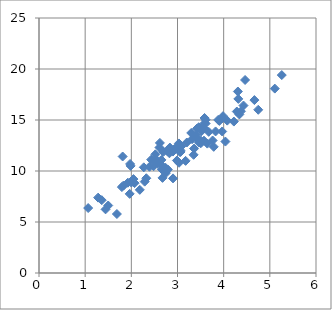
| Category | Series 0 |
|---|---|
| 2.776635329112736 | 11.978 |
| 3.0627706059416373 | 12.02 |
| 3.573220837859455 | 12.973 |
| 2.5729919688299416 | 10.743 |
| 3.9701212152127345 | 15.173 |
| 2.528039879391941 | 11.17 |
| 2.392834814192498 | 10.415 |
| 4.339641156514291 | 15.544 |
| 3.0330298010017316 | 10.809 |
| 2.675731558317578 | 9.325 |
| 3.4202894583534738 | 14.156 |
| 1.9642335198431629 | 7.758 |
| 3.6096875936638693 | 15.028 |
| 2.8251744137852013 | 11.736 |
| 2.324008158845178 | 9.288 |
| 3.3953996699934454 | 13.502 |
| 1.9732571464009183 | 10.69 |
| 1.830726085806746 | 8.575 |
| 3.406402156362916 | 13.241 |
| 5.258765515772204 | 19.405 |
| 2.9006936135904176 | 11.905 |
| 2.1834777482500556 | 8.153 |
| 3.065456208953402 | 11.87 |
| 2.071605085157269 | 8.813 |
| 3.052721922187337 | 11.864 |
| 1.795446064340613 | 8.422 |
| 2.2888764245776074 | 8.958 |
| 2.676469032394853 | 10.465 |
| 2.927668801911281 | 12.113 |
| 1.2808187948254237 | 7.389 |
| 3.0298585976593313 | 12.699 |
| 4.0774765087835805 | 14.938 |
| 3.7609046025933806 | 12.993 |
| 1.0653415892727258 | 6.369 |
| 3.5857766518117327 | 15.198 |
| 1.4418337493860491 | 6.241 |
| 1.687186514839488 | 5.784 |
| 3.3492099743289248 | 11.586 |
| 2.5039318815792626 | 10.93 |
| 2.0462529284198276 | 9.208 |
| 3.5152709845924504 | 13.883 |
| 3.501470167349439 | 12.998 |
| 3.2977546947548313 | 13.73 |
| 2.4831756362459387 | 10.472 |
| 4.038010866442921 | 12.887 |
| 4.220920617072718 | 14.846 |
| 2.5207305976210876 | 11.636 |
| 1.9849389188784725 | 10.5 |
| 3.9682409361356163 | 13.874 |
| 3.5707254571835803 | 14.18 |
| 3.20139886619588 | 12.793 |
| 2.9878140054788784 | 11.031 |
| 2.8668585417348798 | 12.081 |
| 2.6940095998957876 | 11.875 |
| 3.6766164027860073 | 13.84 |
| 3.3822464956298433 | 13.357 |
| 3.0803680055275713 | 12.414 |
| 1.3598272497462176 | 7.14 |
| 3.315629057457269 | 13.119 |
| 2.8355049184042445 | 12.298 |
| 4.31738203171291 | 17.067 |
| 3.610167977616972 | 14.655 |
| 2.65221066213269 | 11.087 |
| 2.9975373963727865 | 12.41 |
| 4.748734950807125 | 16.002 |
| 2.6091553323368766 | 12.303 |
| 2.2701076777123994 | 10.36 |
| 2.9032539837992934 | 9.274 |
| 3.0749053986815538 | 12.425 |
| 3.358971883719362 | 12.197 |
| 4.463733108843235 | 18.924 |
| 4.374194756568604 | 15.858 |
| 1.8123887424702474 | 11.42 |
| 3.8815999501813643 | 15.009 |
| 3.785198208883969 | 12.368 |
| 3.1756955046131363 | 10.994 |
| 4.284738697279019 | 15.829 |
| 2.7425422286014145 | 10.31 |
| 1.499406195382679 | 6.618 |
| 3.646643797289147 | 12.685 |
| 2.7485177906406713 | 9.795 |
| 2.4297932977876746 | 11.112 |
| 4.429504557677972 | 16.419 |
| 5.107696477433887 | 18.079 |
| 2.658273245004114 | 10.171 |
| 3.4600560232421014 | 14.291 |
| 2.791467639177724 | 10.139 |
| 3.4646685664964423 | 12.781 |
| 3.503828873135449 | 12.72 |
| 3.9072675126721794 | 14.913 |
| 2.618394804274969 | 12.753 |
| 1.9996432335495418 | 8.868 |
| 3.0358983949602436 | 12.626 |
| 3.986648010146313 | 15.38 |
| 4.665562772873192 | 16.953 |
| 1.9245696278335553 | 8.852 |
| 3.5892209536630557 | 14.688 |
| 3.8246006491564386 | 13.877 |
| 2.7932509213873584 | 11.991 |
| 4.307766797886078 | 17.794 |